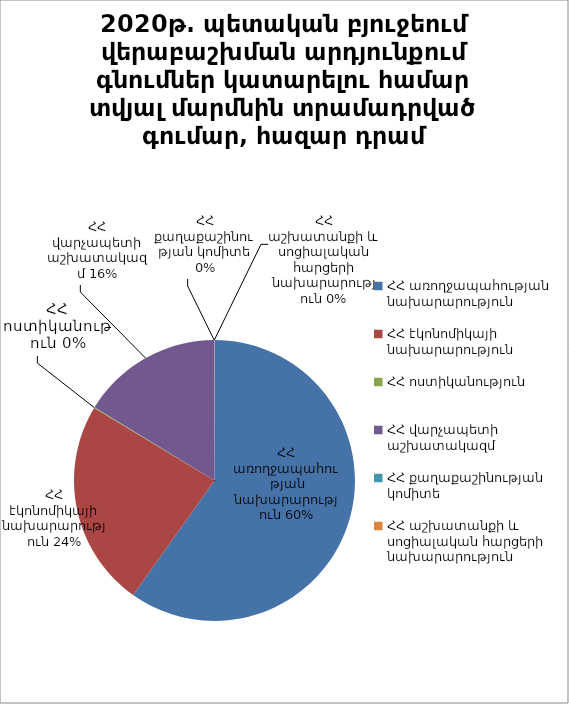
| Category | 2020թ. պետական բյուջեում վերաբաշխման արդյունքում գնումներ կատարելու համար տվյալ մարմնին տրամադրված գումար, հազար դրամ |
|---|---|
| ՀՀ առողջապահության նախարարություն | 7431696.9 |
| ՀՀ էկոնոմիկայի նախարարություն | 2956430.6 |
| ՀՀ ոստիկանություն | 11900 |
| ՀՀ վարչապետի աշխատակազմ | 2016060.1 |
| ՀՀ քաղաքաշինության կոմիտե | 1300 |
| ՀՀ աշխատանքի և սոցիալական հարցերի նախարարություն | 4752 |